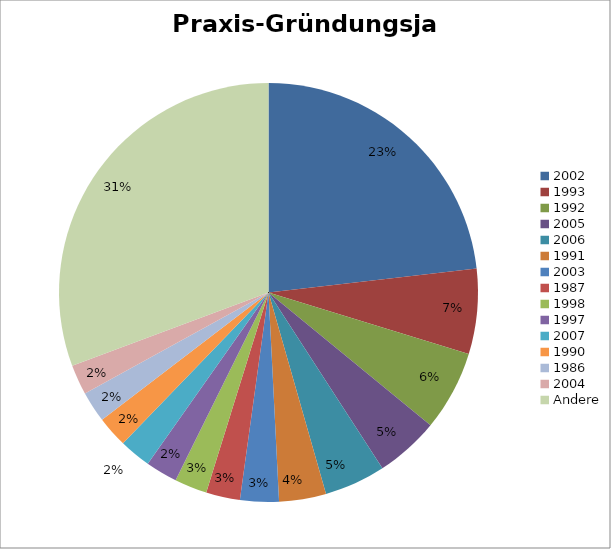
| Category | Series 0 |
|---|---|
| 2002 | 3926 |
| 1993 | 1114 |
| 1992 | 1048 |
| 2005 | 833 |
| 2006 | 800 |
| 1991 | 614 |
| 2003 | 506 |
| 1987 | 444 |
| 1998 | 425 |
| 1997 | 417 |
| 2007 | 414 |
| 1990 | 406 |
| 1986 | 404 |
| 2004 | 393 |
| Andere | 5198 |